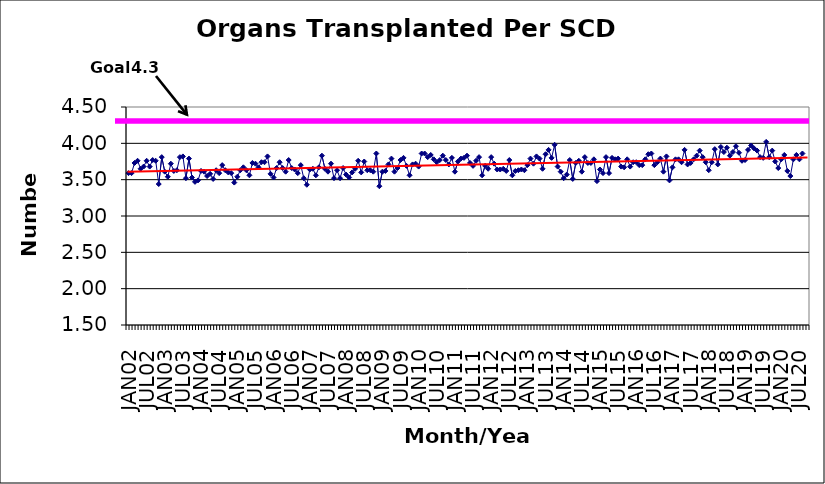
| Category | Series 0 |
|---|---|
| JAN02 | 3.59 |
| FEB02 | 3.59 |
| MAR02 | 3.73 |
| APR02 | 3.76 |
| MAY02 | 3.65 |
| JUN02 | 3.68 |
| JUL02 | 3.76 |
| AUG02 | 3.68 |
| SEP02 | 3.77 |
| OCT02 | 3.76 |
| NOV02 | 3.44 |
| DEC02 | 3.81 |
| JAN03 | 3.61 |
| FEB03 | 3.54 |
| MAR03 | 3.72 |
| APR03 | 3.62 |
| MAY03 | 3.63 |
| JUN03 | 3.81 |
| JUL03 | 3.82 |
| AUG03 | 3.52 |
| SEP03 | 3.79 |
| OCT03 | 3.53 |
| NOV03 | 3.47 |
| DEC03 | 3.49 |
| JAN04 | 3.62 |
| FEB04 | 3.61 |
| MAR04 | 3.55 |
| APR04 | 3.58 |
| MAY04 | 3.51 |
| JUN04 | 3.63 |
| JUL04 | 3.59 |
| AUG04 | 3.7 |
| SEP04 | 3.63 |
| OCT04 | 3.6 |
| NOV04 | 3.59 |
| DEC04 | 3.46 |
| JAN05 | 3.54 |
| FEB05 | 3.63 |
| MAR05 | 3.67 |
| APR05 | 3.63 |
| MAY05 | 3.56 |
| JUN05 | 3.73 |
| JUL05 | 3.72 |
| AUG05 | 3.67 |
| SEP05 | 3.74 |
| OCT05 | 3.74 |
| NOV05 | 3.82 |
| DEC05 | 3.58 |
| JAN06 | 3.53 |
| FEB06 | 3.66 |
| MAR06 | 3.74 |
| APR06 | 3.66 |
| MAY06 | 3.61 |
| JUN06 | 3.77 |
| JUL06 | 3.66 |
| AUG06 | 3.64 |
| SEP06 | 3.59 |
| OCT06 | 3.7 |
| NOV06 | 3.52 |
| DEC06 | 3.43 |
| JAN07 | 3.64 |
| FEB07 | 3.65 |
| MAR07 | 3.56 |
| APR07 | 3.67 |
| MAY07 | 3.83 |
| JUN07 | 3.65 |
| JUL07 | 3.61 |
| AUG07 | 3.72 |
| SEP07 | 3.52 |
| OCT07 | 3.63 |
| NOV07 | 3.52 |
| DEC07 | 3.66 |
| JAN08 | 3.57 |
| FEB08 | 3.53 |
| MAR08 | 3.6 |
| APR08 | 3.65 |
| MAY08 | 3.76 |
| JUN08 | 3.6 |
| JUL08 | 3.75 |
| AUG08 | 3.63 |
| SEP08 | 3.63 |
| OCT08 | 3.61 |
| NOV08 | 3.86 |
| DEC08 | 3.41 |
| JAN09 | 3.61 |
| FEB09 | 3.62 |
| MAR09 | 3.71 |
| APR09 | 3.79 |
| MAY09 | 3.61 |
| JUN09 | 3.66 |
| JUL09 | 3.77 |
| AUG09 | 3.8 |
| SEP09 | 3.69 |
| OCT09 | 3.56 |
| NOV09 | 3.71 |
| DEC09 | 3.72 |
| JAN10 | 3.68 |
| FEB10 | 3.86 |
| MAR10 | 3.86 |
| APR10 | 3.81 |
| MAY10 | 3.84 |
| JUN10 | 3.78 |
| JUL10 | 3.74 |
| AUG10 | 3.77 |
| SEP10 | 3.83 |
| OCT10 | 3.77 |
| NOV10 | 3.71 |
| DEC10 | 3.8 |
| JAN11 | 3.61 |
| FEB11 | 3.75 |
| MAR11 | 3.79 |
| APR11 | 3.8 |
| MAY11 | 3.83 |
| JUN11 | 3.73 |
| JUL11 | 3.69 |
| AUG11 | 3.76 |
| SEP11 | 3.81 |
| OCT11 | 3.56 |
| NOV11 | 3.69 |
| DEC11 | 3.65 |
| JAN12 | 3.81 |
| FEB12 | 3.72 |
| MAR12 | 3.64 |
| APR12 | 3.64 |
| MAY12 | 3.65 |
| JUN12 | 3.62 |
| JUL12 | 3.77 |
| AUG12 | 3.56 |
| SEP12 | 3.62 |
| OCT12 | 3.63 |
| NOV12 | 3.64 |
| DEC12 | 3.63 |
| JAN13 | 3.7 |
| FEB13 | 3.79 |
| MAR13 | 3.72 |
| APR13 | 3.82 |
| MAY13 | 3.79 |
| JUN13 | 3.65 |
| JUL13 | 3.85 |
| AUG13 | 3.91 |
| SEP13 | 3.8 |
| OCT13 | 3.98 |
| NOV13 | 3.68 |
| DEC13 | 3.61 |
| JAN14 | 3.52 |
| FEB14 | 3.57 |
| MAR14 | 3.77 |
| APR14 | 3.51 |
| MAY14 | 3.73 |
| JUN14 | 3.76 |
| JUL14 | 3.61 |
| AUG14 | 3.81 |
| SEP14 | 3.73 |
| OCT14 | 3.73 |
| NOV14 | 3.78 |
| DEC14 | 3.48 |
| JAN15 | 3.64 |
| FEB15 | 3.59 |
| MAR15 | 3.81 |
| APR15 | 3.59 |
| MAY15 | 3.8 |
| JUN15 | 3.78 |
| JUL15 | 3.79 |
| AUG15 | 3.68 |
| SEP15 | 3.67 |
| OCT15 | 3.78 |
| NOV15 | 3.68 |
| DEC15 | 3.74 |
| JAN16 | 3.74 |
| FEB16 | 3.7 |
| MAR16 | 3.7 |
| APR16 | 3.78 |
| MAY16 | 3.85 |
| JUN16 | 3.86 |
| JUL16 | 3.7 |
| AUG16 | 3.74 |
| SEP16 | 3.79 |
| OCT16 | 3.61 |
| NOV16 | 3.82 |
| DEC16 | 3.49 |
| JAN17 | 3.67 |
| FEB17 | 3.78 |
| MAR17 | 3.78 |
| APR17 | 3.74 |
| MAY17 | 3.91 |
| JUN17 | 3.71 |
| JUL17 | 3.73 |
| AUG17 | 3.78 |
| SEP17 | 3.83 |
| OCT17 | 3.9 |
| NOV17 | 3.81 |
| DEC17 | 3.74 |
| JAN18 | 3.63 |
| FEB18 | 3.74 |
| MAR18 | 3.92 |
| APR18 | 3.71 |
| MAY18 | 3.95 |
| JUN18 | 3.88 |
| JUL18 | 3.94 |
| AUG18 | 3.83 |
| SEP18 | 3.88 |
| OCT18 | 3.96 |
| NOV18 | 3.87 |
| DEC18 | 3.76 |
| JAN19 | 3.77 |
| FEB19 | 3.91 |
| MAR19 | 3.97 |
| APR19 | 3.93 |
| MAY19 | 3.9 |
| JUN19 | 3.81 |
| JUL19 | 3.8 |
| AUG19 | 4.02 |
| SEP19 | 3.81 |
| OCT19 | 3.9 |
| NOV19 | 3.75 |
| DEC19 | 3.66 |
| JAN20 | 3.78 |
| FEB20 | 3.84 |
| MAR20 | 3.62 |
| APR20 | 3.55 |
| MAY20 | 3.78 |
| JUN20 | 3.84 |
| JUL20 | 3.78 |
| AUG20 | 3.86 |